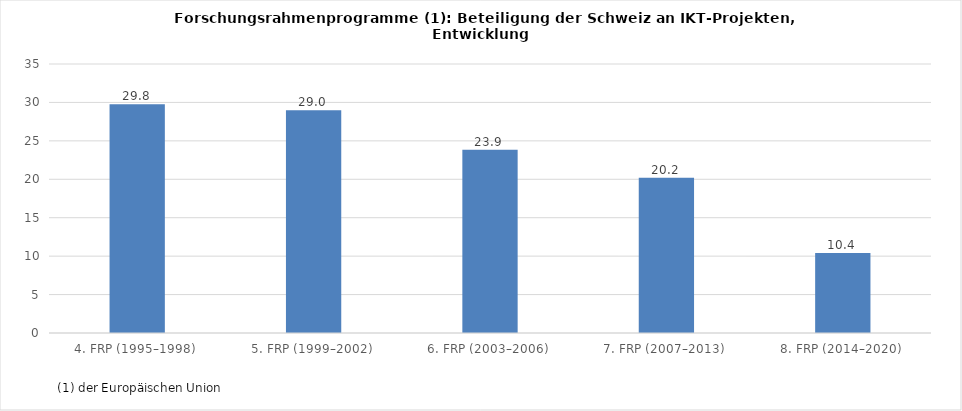
| Category | Series 0 |
|---|---|
| 4. FRP (1995–1998)  | 29.759 |
| 5. FRP (1999–2002)  | 28.988 |
| 6. FRP (2003–2006)  | 23.852 |
| 7. FRP (2007–2013)  | 20.196 |
| 8. FRP (2014–2020)  | 10.396 |